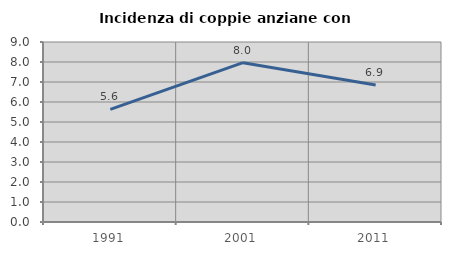
| Category | Incidenza di coppie anziane con figli |
|---|---|
| 1991.0 | 5.631 |
| 2001.0 | 7.967 |
| 2011.0 | 6.854 |